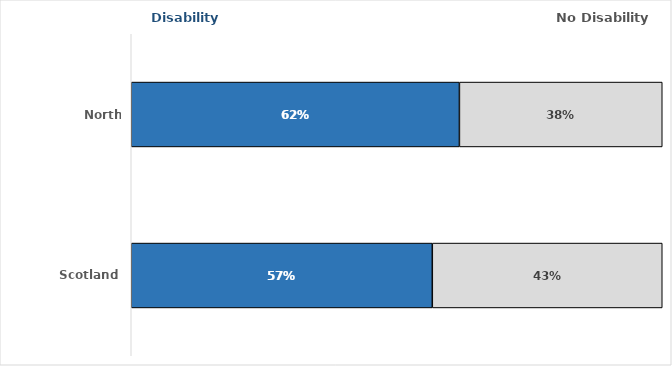
| Category | Disability | No Disability |
|---|---|---|
| North Lanarkshire | 0.618 | 0.382 |
| Scotland | 0.567 | 0.433 |